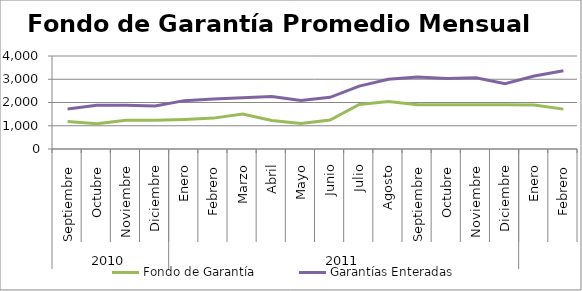
| Category | Fondo de Garantía | Garantías Enteradas |
|---|---|---|
| 0 | 1186.765 | 1723.136 |
| 1 | 1091.277 | 1878.561 |
| 2 | 1240.142 | 1886.493 |
| 3 | 1233.184 | 1848.941 |
| 4 | 1267.175 | 2079.773 |
| 5 | 1328.315 | 2151.804 |
| 6 | 1507.218 | 2200.488 |
| 7 | 1222.61 | 2253.818 |
| 8 | 1097.438 | 2081.441 |
| 9 | 1248.758 | 2223.666 |
| 10 | 1917.982 | 2706.525 |
| 11 | 2038.339 | 3002.384 |
| 12 | 1900.513 | 3095.395 |
| 13 | 1900.513 | 3029.373 |
| 14 | 1900.513 | 3060.179 |
| 15 | 1900.513 | 2809.042 |
| 16 | 1896.798 | 3141.641 |
| 17 | 1714.423 | 3362.648 |